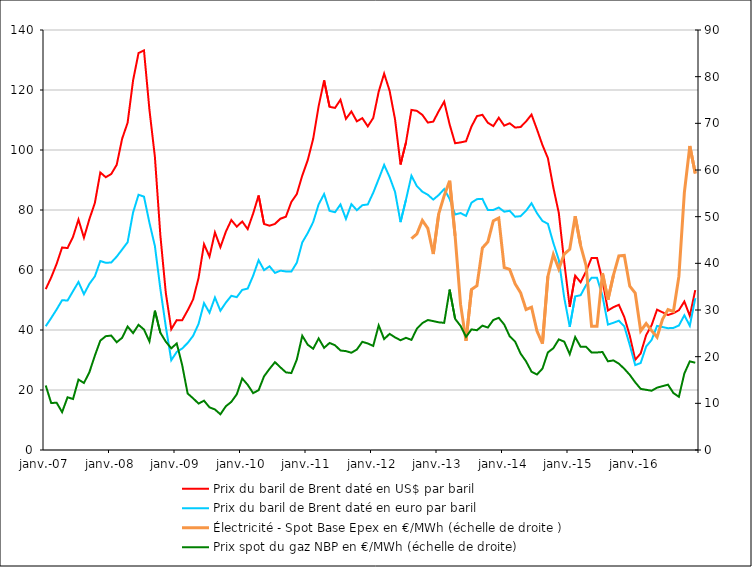
| Category | Prix du baril de Brent daté en US$ par baril | Prix du baril de Brent daté en euro par baril |
|---|---|---|
| 2007-01-01 | 53.63 | 41.258 |
| 2007-02-01 | 57.52 | 43.995 |
| 2007-03-01 | 62.05 | 46.859 |
| 2007-04-01 | 67.49 | 49.936 |
| 2007-05-01 | 67.32 | 49.824 |
| 2007-06-01 | 71.05 | 52.946 |
| 2007-07-01 | 76.82 | 56.009 |
| 2007-08-01 | 70.76 | 51.945 |
| 2007-09-01 | 76.97 | 55.388 |
| 2007-10-01 | 82.34 | 57.874 |
| 2007-11-01 | 92.51 | 62.999 |
| 2007-12-01 | 90.93 | 62.407 |
| 2008-01-01 | 91.99 | 62.498 |
| 2008-02-01 | 95.05 | 64.453 |
| 2008-03-01 | 103.78 | 66.841 |
| 2008-04-01 | 109.07 | 69.249 |
| 2008-05-01 | 123.15 | 79.161 |
| 2008-06-01 | 132.32 | 85.082 |
| 2008-07-01 | 133.19 | 84.456 |
| 2008-08-01 | 113.42 | 75.742 |
| 2008-09-01 | 97.7 | 67.989 |
| 2008-10-01 | 71.59 | 53.735 |
| 2008-11-01 | 52.34 | 41.108 |
| 2008-12-01 | 40.25 | 29.927 |
| 2009-01-01 | 43.29 | 32.7 |
| 2009-02-01 | 43.26 | 33.837 |
| 2009-03-01 | 46.54 | 35.664 |
| 2009-04-01 | 50.19 | 38.049 |
| 2009-05-01 | 57.38 | 42.037 |
| 2009-06-01 | 68.61 | 48.953 |
| 2009-07-01 | 64.46 | 45.754 |
| 2009-08-01 | 72.52 | 50.829 |
| 2009-09-01 | 67.61 | 46.428 |
| 2009-10-01 | 72.77 | 49.127 |
| 2009-11-01 | 76.65 | 51.394 |
| 2009-12-01 | 74.46 | 50.953 |
| 2010-01-01 | 76.17 | 53.372 |
| 2010-02-01 | 73.64 | 53.809 |
| 2010-03-01 | 78.83 | 58.098 |
| 2010-04-01 | 84.84 | 63.274 |
| 2010-05-01 | 75.31 | 59.947 |
| 2010-06-01 | 74.76 | 61.236 |
| 2010-07-01 | 75.39 | 59.038 |
| 2010-08-01 | 77.09 | 59.783 |
| 2010-09-01 | 77.77 | 59.517 |
| 2010-10-01 | 82.67 | 59.481 |
| 2010-11-01 | 85.29 | 62.432 |
| 2010-12-01 | 91.47 | 69.188 |
| 2011-01-01 | 96.61 | 72.313 |
| 2011-02-01 | 103.73 | 76.003 |
| 2011-03-01 | 114.64 | 81.887 |
| 2011-04-01 | 123.21 | 85.311 |
| 2011-05-01 | 114.4 | 79.725 |
| 2011-06-01 | 114.03 | 79.251 |
| 2011-07-01 | 116.75 | 81.853 |
| 2011-08-01 | 110.38 | 77.034 |
| 2011-09-01 | 112.84 | 81.944 |
| 2011-10-01 | 109.55 | 79.928 |
| 2011-11-01 | 110.61 | 81.597 |
| 2011-12-01 | 107.87 | 81.852 |
| 2012-01-01 | 110.68 | 85.766 |
| 2012-02-01 | 119.44 | 90.321 |
| 2012-03-01 | 125.45 | 95.028 |
| 2012-04-01 | 119.75 | 90.986 |
| 2012-05-01 | 110.17 | 86.021 |
| 2012-06-01 | 95.16 | 75.966 |
| 2012-07-01 | 102.54 | 83.447 |
| 2012-08-01 | 113.364 | 91.428 |
| 2012-09-01 | 113.046 | 87.939 |
| 2012-10-01 | 111.7 | 86.098 |
| 2012-11-01 | 109.144 | 85.088 |
| 2012-12-01 | 109.464 | 83.466 |
| 2013-01-01 | 112.946 | 85.003 |
| 2013-02-01 | 116.129 | 86.981 |
| 2013-03-01 | 108.498 | 83.695 |
| 2013-04-01 | 102.256 | 78.502 |
| 2013-05-01 | 102.529 | 78.978 |
| 2013-06-01 | 102.92 | 78.034 |
| 2013-07-01 | 107.83 | 82.436 |
| 2013-08-01 | 111.29 | 83.612 |
| 2013-09-01 | 111.73 | 83.708 |
| 2013-10-01 | 109.08 | 79.999 |
| 2013-11-01 | 107.96 | 80.009 |
| 2013-12-01 | 110.76 | 80.822 |
| 2014-01-01 | 108.12 | 79.436 |
| 2014-02-01 | 108.91 | 79.733 |
| 2014-03-01 | 107.48 | 77.762 |
| 2014-04-01 | 107.66 | 77.946 |
| 2014-05-01 | 109.52 | 79.752 |
| 2014-06-01 | 111.8 | 82.251 |
| 2014-07-01 | 106.861 | 78.928 |
| 2014-08-01 | 101.664 | 76.35 |
| 2014-09-01 | 97.287 | 75.397 |
| 2014-10-01 | 87.463 | 69.017 |
| 2014-11-01 | 79.002 | 63.343 |
| 2014-12-01 | 62.51 | 50.689 |
| 2015-01-01 | 47.708 | 41.053 |
| 2015-02-01 | 58.1 | 51.2 |
| 2015-03-01 | 55.9 | 51.6 |
| 2015-04-01 | 59.6 | 55 |
| 2015-05-01 | 64 | 57.4 |
| 2015-06-01 | 64 | 57.4 |
| 2015-07-01 | 56.6 | 51.4 |
| 2015-08-01 | 46.5 | 41.8 |
| 2015-09-01 | 47.6 | 42.4 |
| 2015-10-01 | 48.4 | 43.1 |
| 2015-11-01 | 44.3 | 41.2 |
| 2015-12-01 | 38.1 | 35 |
| 2016-01-01 | 30.07 | 28.3 |
| 2016-02-01 | 32.2 | 29 |
| 2016-03-01 | 38.3 | 34.5 |
| 2016-04-01 | 41.58 | 36.674 |
| 2016-05-01 | 46.788 | 41.361 |
| 2016-06-01 | 45.894 | 40.981 |
| 2016-07-01 | 45 | 40.6 |
| 2016-08-01 | 45.6 | 40.7 |
| 2016-09-01 | 46.6 | 41.5 |
| 2016-10-01 | 49.5 | 44.9 |
| 2016-11-01 | 44.7 | 41.4 |
| 2016-12-01 | 53.3 | 50.6 |